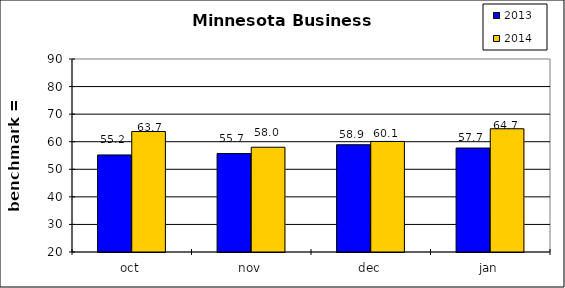
| Category | 2013 | 2014 |
|---|---|---|
| oct | 55.2 | 63.7 |
| nov | 55.7 | 58 |
| dec | 58.9 | 60.1 |
| jan | 57.7 | 64.7 |